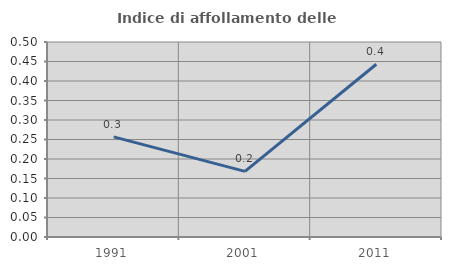
| Category | Indice di affollamento delle abitazioni  |
|---|---|
| 1991.0 | 0.257 |
| 2001.0 | 0.168 |
| 2011.0 | 0.443 |